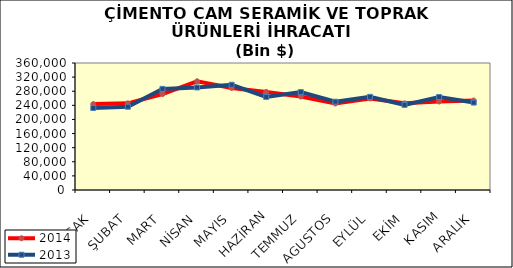
| Category | 2014 | 2013 |
|---|---|---|
| OCAK | 243550.063 | 232432.569 |
| ŞUBAT | 245731.551 | 236027.054 |
| MART | 271966.623 | 286631.218 |
| NİSAN | 308165.531 | 290672.978 |
| MAYIS | 289421.705 | 298359.03 |
| HAZİRAN | 278037.883 | 263835.686 |
| TEMMUZ | 265000.489 | 277557.419 |
| AGUSTOS | 245320.418 | 250243.504 |
| EYLÜL | 259601.279 | 264058.522 |
| EKİM | 245648.941 | 241268.357 |
| KASIM | 250886.656 | 263633.485 |
| ARALIK | 253542.677 | 247833.912 |